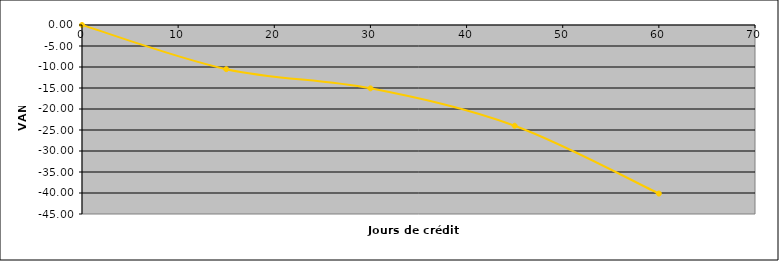
| Category | VAN |
|---|---|
| 0.0 | 0 |
| 15.0 | -10.513 |
| 30.0 | -15.084 |
| 45.0 | -23.986 |
| 60.0 | -40.138 |